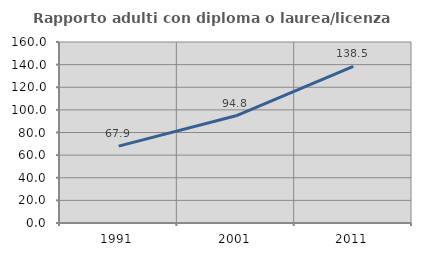
| Category | Rapporto adulti con diploma o laurea/licenza media  |
|---|---|
| 1991.0 | 67.917 |
| 2001.0 | 94.771 |
| 2011.0 | 138.486 |